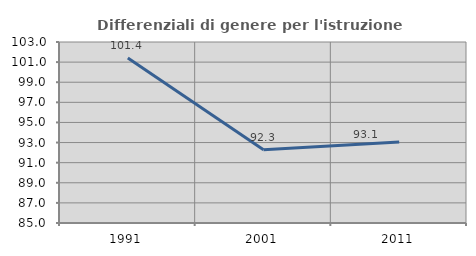
| Category | Differenziali di genere per l'istruzione superiore |
|---|---|
| 1991.0 | 101.415 |
| 2001.0 | 92.284 |
| 2011.0 | 93.061 |